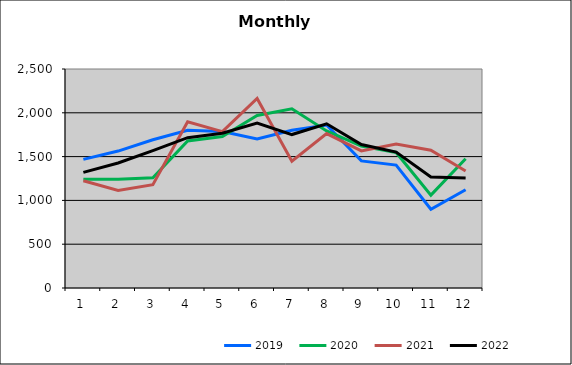
| Category | 2019 | 2020 | 2021 | 2022 |
|---|---|---|---|---|
| 0 | 1467.961 | 1241.004 | 1224.945 | 1320.378 |
| 1 | 1563.301 | 1241.851 | 1112.955 | 1427.347 |
| 2 | 1692.17 | 1257.948 | 1179.01 | 1568.913 |
| 3 | 1799.954 | 1678.799 | 1897.827 | 1716.298 |
| 4 | 1787.008 | 1728.302 | 1784.624 | 1766.266 |
| 5 | 1700.928 | 1969.438 | 2163.63 | 1882.126 |
| 6 | 1800.379 | 2046.582 | 1448.352 | 1751.676 |
| 7 | 1860.378 | 1792.692 | 1763.243 | 1874.424 |
| 8 | 1451.067 | 1620.398 | 1564.861 | 1638.272 |
| 9 | 1402.587 | 1547.501 | 1643.384 | 1550.971 |
| 10 | 899.124 | 1060.179 | 1572.259 | 1266.472 |
| 11 | 1120.919 | 1476.203 | 1336.135 | 1256.044 |